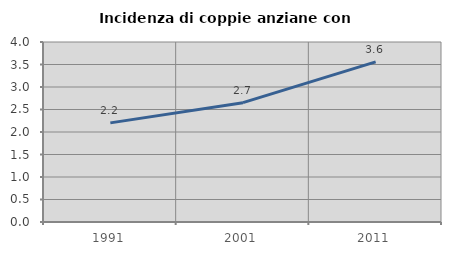
| Category | Incidenza di coppie anziane con figli |
|---|---|
| 1991.0 | 2.203 |
| 2001.0 | 2.652 |
| 2011.0 | 3.559 |